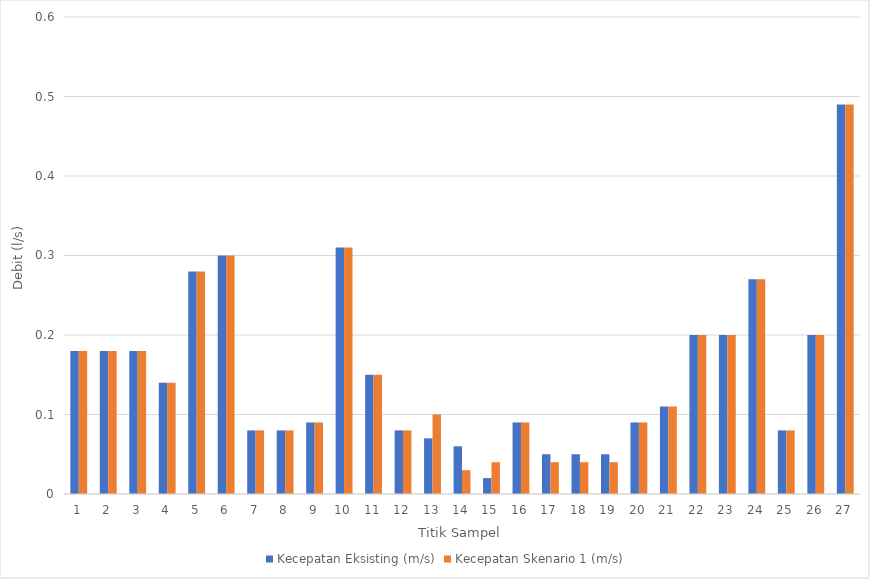
| Category | Kecepatan Eksisting (m/s) | Kecepatan Skenario 1 (m/s) |
|---|---|---|
| 0 | 0.18 | 0.18 |
| 1 | 0.18 | 0.18 |
| 2 | 0.18 | 0.18 |
| 3 | 0.14 | 0.14 |
| 4 | 0.28 | 0.28 |
| 5 | 0.3 | 0.3 |
| 6 | 0.08 | 0.08 |
| 7 | 0.08 | 0.08 |
| 8 | 0.09 | 0.09 |
| 9 | 0.31 | 0.31 |
| 10 | 0.15 | 0.15 |
| 11 | 0.08 | 0.08 |
| 12 | 0.07 | 0.1 |
| 13 | 0.06 | 0.03 |
| 14 | 0.02 | 0.04 |
| 15 | 0.09 | 0.09 |
| 16 | 0.05 | 0.04 |
| 17 | 0.05 | 0.04 |
| 18 | 0.05 | 0.04 |
| 19 | 0.09 | 0.09 |
| 20 | 0.11 | 0.11 |
| 21 | 0.2 | 0.2 |
| 22 | 0.2 | 0.2 |
| 23 | 0.27 | 0.27 |
| 24 | 0.08 | 0.08 |
| 25 | 0.2 | 0.2 |
| 26 | 0.49 | 0.49 |